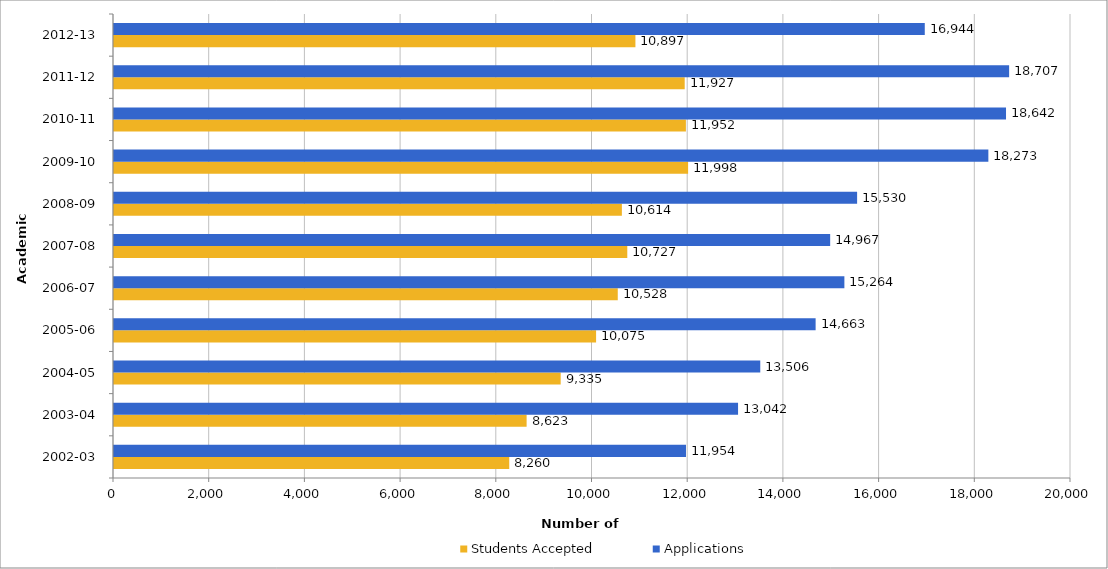
| Category | Students Accepted | Applications |
|---|---|---|
| 2002-03 | 8260 | 11954 |
| 2003-04 | 8623 | 13042 |
| 2004-05 | 9335 | 13506 |
| 2005-06 | 10075 | 14663 |
| 2006-07 | 10528 | 15264 |
| 2007-08 | 10727 | 14967 |
| 2008-09 | 10614 | 15530 |
| 2009-10 | 11998 | 18273 |
| 2010-11 | 11952 | 18642 |
| 2011-12 | 11927 | 18707 |
| 2012-13 | 10897 | 16944 |